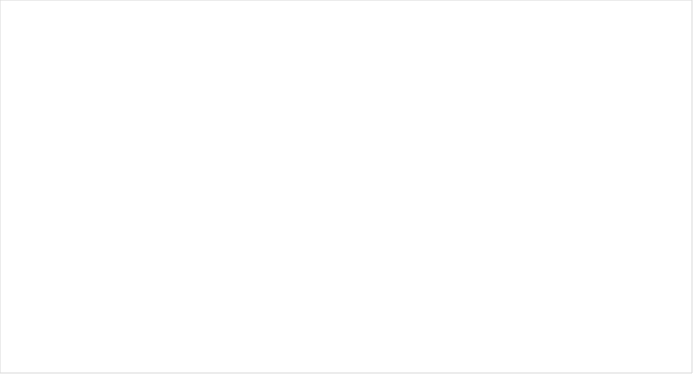
| Category | Total |
|---|---|
| Boston | 79 |
| Central | 80 |
| Metro West | 96 |
| Northeast | 78 |
| Southeast | 96 |
| Western | 89 |